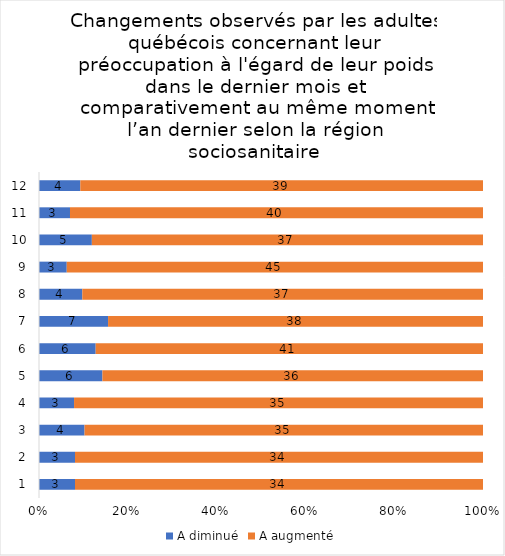
| Category | A diminué | A augmenté |
|---|---|---|
| 0 | 3 | 34 |
| 1 | 3 | 34 |
| 2 | 4 | 35 |
| 3 | 3 | 35 |
| 4 | 6 | 36 |
| 5 | 6 | 41 |
| 6 | 7 | 38 |
| 7 | 4 | 37 |
| 8 | 3 | 45 |
| 9 | 5 | 37 |
| 10 | 3 | 40 |
| 11 | 4 | 39 |